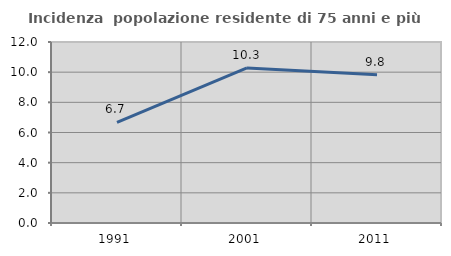
| Category | Incidenza  popolazione residente di 75 anni e più |
|---|---|
| 1991.0 | 6.667 |
| 2001.0 | 10.28 |
| 2011.0 | 9.836 |